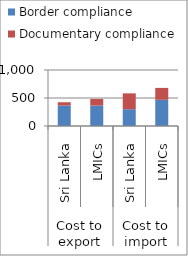
| Category | Border compliance | Documentary compliance |
|---|---|---|
| 0 | 366 | 58 |
| 1 | 365.484 | 117.468 |
| 2 | 300 | 283 |
| 3 | 467.81 | 212.345 |